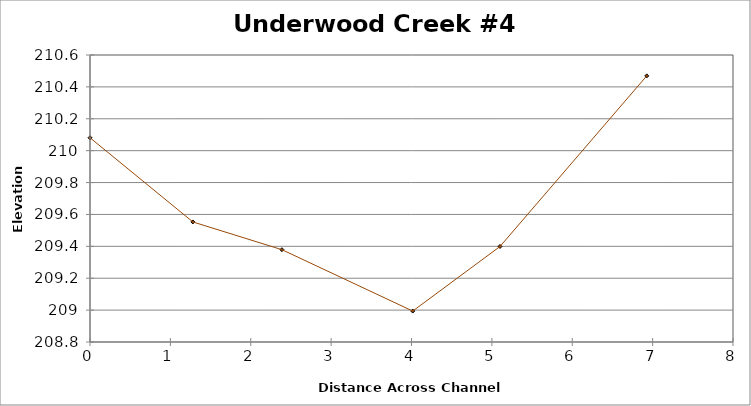
| Category | Series 0 |
|---|---|
| 0.0 | 210.081 |
| 1.279850772443163 | 209.553 |
| 2.3877793030410213 | 209.379 |
| 4.015511548957959 | 208.994 |
| 5.101075278739726 | 209.399 |
| 6.926919806099885 | 210.469 |